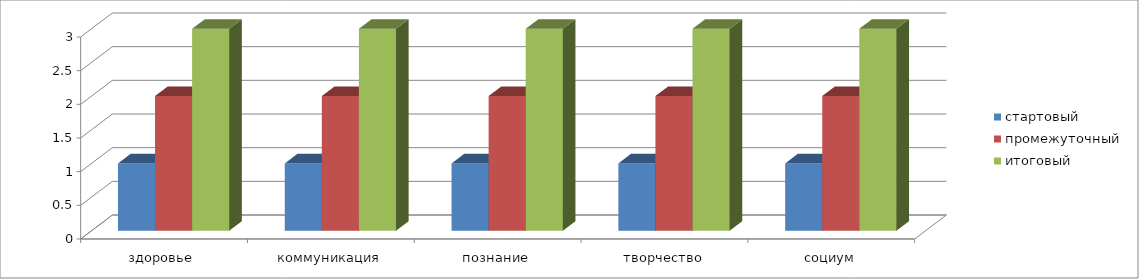
| Category | стартовый | промежуточный | итоговый |
|---|---|---|---|
| здоровье  | 1 | 2 | 3 |
| коммуникация | 1 | 2 | 3 |
| познание | 1 | 2 | 3 |
| творчество | 1 | 2 | 3 |
| социум | 1 | 2 | 3 |